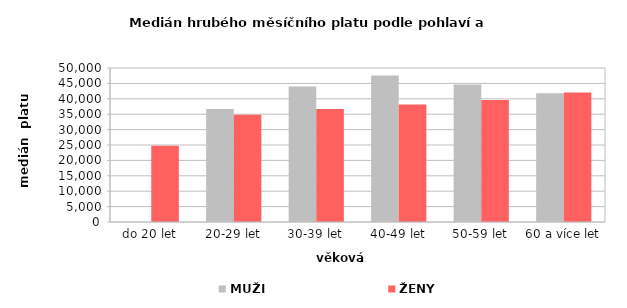
| Category | MUŽI | ŽENY |
|---|---|---|
| 0 | 0 | 24740.721 |
| 1 | 36665.706 | 34820.218 |
| 2 | 44032.703 | 36657.772 |
| 3 | 47535.534 | 38181.614 |
| 4 | 44631.329 | 39625.295 |
| 5 | 41816.053 | 42020.109 |